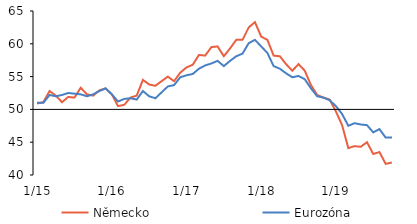
| Category | Německo | Eurozóna |
|---|---|---|
|  1/15 | 50.9 | 51 |
| 2 | 51.1 | 51 |
| 3 | 52.8 | 52.2 |
| 4 | 52.1 | 52 |
| 5 | 51.1 | 52.2 |
| 6 | 51.9 | 52.5 |
| 7 | 51.8 | 52.4 |
| 8 | 53.3 | 52.3 |
| 9 | 52.3 | 52 |
| 10 | 52.1 | 52.3 |
| 11 | 52.9 | 52.8 |
| 12 | 53.2 | 53.2 |
|  1/16 | 52.3 | 52.3 |
| 2 | 50.5 | 51.2 |
| 3 | 50.7 | 51.6 |
| 4 | 51.8 | 51.7 |
| 5 | 52.1 | 51.5 |
| 6 | 54.5 | 52.8 |
| 7 | 53.8 | 52 |
| 8 | 53.6 | 51.7 |
| 9 | 54.3 | 52.6 |
| 10 | 55 | 53.5 |
| 11 | 54.3 | 53.7 |
| 12 | 55.6 | 54.9 |
|  1/17 | 56.4 | 55.2 |
| 2 | 56.8 | 55.4 |
| 3 | 58.3 | 56.2 |
| 4 | 58.2 | 56.7 |
| 5 | 59.5 | 57 |
| 6 | 59.6 | 57.4 |
| 7 | 58.1 | 56.6 |
| 8 | 59.3 | 57.4 |
| 9 | 60.6 | 58.1 |
| 10 | 60.6 | 58.5 |
| 11 | 62.5 | 60.1 |
| 12 | 63.3 | 60.6 |
|  1/18 | 61.1 | 59.6 |
| 2 | 60.6 | 58.6 |
| 3 | 58.2 | 56.6 |
| 4 | 58.1 | 56.2 |
| 5 | 56.9 | 55.5 |
| 6 | 55.9 | 54.9 |
| 7 | 56.9 | 55.1 |
| 8 | 55.9 | 54.6 |
| 9 | 53.7 | 53.2 |
| 10 | 52.2 | 52 |
| 11 | 51.8 | 51.8 |
| 12 | 51.5 | 51.4 |
|  1/19 | 49.7 | 50.5 |
| 2 | 47.6 | 49.3 |
| 3 | 44.1 | 47.5 |
| 4 | 44.4 | 47.9 |
| 5 | 44.3 | 47.7 |
| 6 | 45 | 47.6 |
| 7 | 43.2 | 46.5 |
| 8 | 43.5 | 47 |
| 9 | 41.7 | 45.7 |
| 10 | 41.9 | 45.7 |